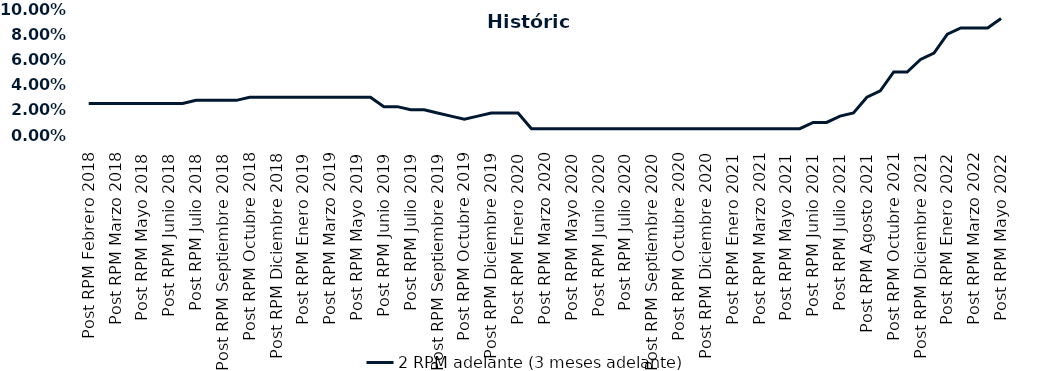
| Category | 2 RPM adelante (3 meses adelante) |
|---|---|
| Post RPM Febrero 2018 | 0.025 |
| Pre RPM Marzo 2018 | 0.025 |
| Post RPM Marzo 2018 | 0.025 |
| Pre RPM Mayo 2018 | 0.025 |
| Post RPM Mayo 2018 | 0.025 |
| Pre RPM Junio 2018 | 0.025 |
| Post RPM Junio 2018 | 0.025 |
| Pre RPM Julio 2018 | 0.025 |
| Post RPM Julio 2018 | 0.028 |
| Pre RPM Septiembre 2018 | 0.028 |
| Post RPM Septiembre 2018 | 0.028 |
| Pre RPM Octubre 2018 | 0.028 |
| Post RPM Octubre 2018 | 0.03 |
| Pre RPM Diciembre 2018 | 0.03 |
| Post RPM Diciembre 2018 | 0.03 |
| Pre RPM Enero 2019 | 0.03 |
| Post RPM Enero 2019 | 0.03 |
| Pre RPM Marzo 2019 | 0.03 |
| Post RPM Marzo 2019 | 0.03 |
| Pre RPM Mayo 2019 | 0.03 |
| Post RPM Mayo 2019 | 0.03 |
| Pre RPM Junio 2019 | 0.03 |
| Post RPM Junio 2019 | 0.022 |
| Pre RPM Julio 2019 | 0.022 |
| Post RPM Julio 2019 | 0.02 |
| Pre RPM Septiembre 2019 | 0.02 |
| Post RPM Septiembre 2019 | 0.018 |
| Pre RPM Octubre 2019 | 0.015 |
| Post RPM Octubre 2019 | 0.012 |
| Pre RPM Diciembre 2019 | 0.015 |
| Post RPM Diciembre 2019 | 0.018 |
| Pre RPM Enero 2020 | 0.018 |
| Post RPM Enero 2020 | 0.018 |
| Pre RPM Marzo 2020 | 0.005 |
| Post RPM Marzo 2020 | 0.005 |
| Pre RPM Mayo 2020 | 0.005 |
| Post RPM Mayo 2020 | 0.005 |
| Pre RPM Junio 2020 | 0.005 |
| Post RPM Junio 2020 | 0.005 |
| Pre RPM Julio 2020 | 0.005 |
| Post RPM Julio 2020 | 0.005 |
| Pre RPM Septiembre 2020 | 0.005 |
| Post RPM Septiembre 2020 | 0.005 |
| Pre RPM Octubre 2020 | 0.005 |
| Post RPM Octubre 2020 | 0.005 |
| Pre RPM Diciembre 2020 | 0.005 |
| Post RPM Diciembre 2020 | 0.005 |
| Pre RPM Enero 2021 | 0.005 |
| Post RPM Enero 2021 | 0.005 |
| Pre RPM Marzo 2021 | 0.005 |
| Post RPM Marzo 2021 | 0.005 |
| Pre RPM Mayo 2021 | 0.005 |
| Post RPM Mayo 2021 | 0.005 |
| Pre RPM Junio 2021 | 0.005 |
| Post RPM Junio 2021 | 0.01 |
| Pre RPM Julio 2021 | 0.01 |
| Post RPM Julio 2021 | 0.015 |
| Pre RPM Agosto 2021 | 0.018 |
| Post RPM Agosto 2021 | 0.03 |
| Pre RPM Octubre 2021 | 0.035 |
| Post RPM Octubre 2021 | 0.05 |
| Pre RPM Diciembre 2021 | 0.05 |
| Post RPM Diciembre 2021 | 0.06 |
| Pre RPM Enero 2022 | 0.065 |
| Post RPM Enero 2022 | 0.08 |
| Pre RPM Marzo 2022 | 0.085 |
| Post RPM Marzo 2022 | 0.085 |
| Pre RPM Mayo 2022 | 0.085 |
| Post RPM Mayo 2022 | 0.092 |